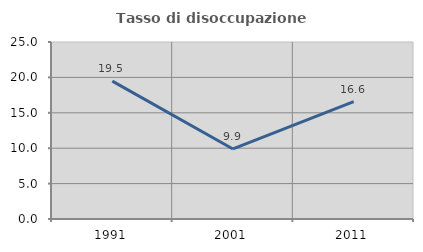
| Category | Tasso di disoccupazione giovanile  |
|---|---|
| 1991.0 | 19.476 |
| 2001.0 | 9.89 |
| 2011.0 | 16.564 |